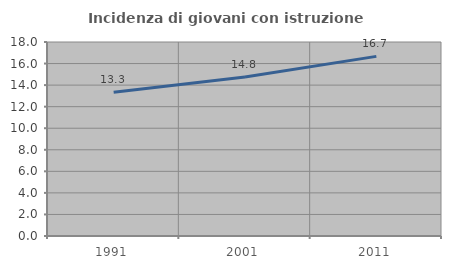
| Category | Incidenza di giovani con istruzione universitaria |
|---|---|
| 1991.0 | 13.333 |
| 2001.0 | 14.754 |
| 2011.0 | 16.667 |